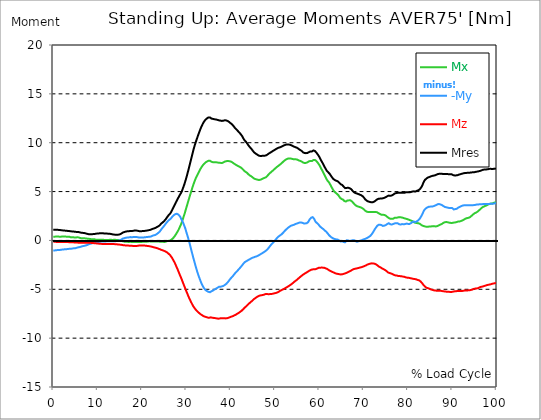
| Category |  Mx |  -My |  Mz |  Mres |
|---|---|---|---|---|
| 0.0 | 0.381 | -1.022 | -0.15 | 1.103 |
| 0.167348456675344 | 0.381 | -1.022 | -0.14 | 1.103 |
| 0.334696913350688 | 0.381 | -1.022 | -0.14 | 1.103 |
| 0.5020453700260321 | 0.401 | -1.012 | -0.15 | 1.103 |
| 0.669393826701376 | 0.411 | -1.002 | -0.15 | 1.103 |
| 0.83674228337672 | 0.421 | -0.992 | -0.15 | 1.093 |
| 1.0040907400520642 | 0.411 | -0.982 | -0.15 | 1.083 |
| 1.1621420602454444 | 0.391 | -0.992 | -0.15 | 1.083 |
| 1.3294905169207885 | 0.381 | -0.982 | -0.16 | 1.073 |
| 1.4968389735961325 | 0.371 | -0.972 | -0.16 | 1.063 |
| 1.6641874302714765 | 0.381 | -0.962 | -0.16 | 1.053 |
| 1.8315358869468206 | 0.391 | -0.952 | -0.16 | 1.043 |
| 1.9988843436221646 | 0.401 | -0.932 | -0.16 | 1.033 |
| 2.1662328002975086 | 0.401 | -0.922 | -0.16 | 1.022 |
| 2.333581256972853 | 0.391 | -0.922 | -0.16 | 1.012 |
| 2.5009297136481967 | 0.381 | -0.912 | -0.16 | 1.002 |
| 2.6682781703235405 | 0.401 | -0.892 | -0.16 | 1.002 |
| 2.8356266269988843 | 0.401 | -0.892 | -0.17 | 0.992 |
| 3.002975083674229 | 0.381 | -0.892 | -0.17 | 0.982 |
| 3.1703235403495724 | 0.371 | -0.882 | -0.17 | 0.982 |
| 3.337671997024917 | 0.381 | -0.872 | -0.17 | 0.972 |
| 3.4957233172182973 | 0.381 | -0.862 | -0.17 | 0.962 |
| 3.663071773893641 | 0.371 | -0.852 | -0.18 | 0.952 |
| 3.8304202305689854 | 0.341 | -0.852 | -0.19 | 0.942 |
| 3.997768687244329 | 0.311 | -0.852 | -0.19 | 0.932 |
| 4.165117143919673 | 0.321 | -0.832 | -0.19 | 0.922 |
| 4.332465600595017 | 0.331 | -0.822 | -0.19 | 0.912 |
| 4.499814057270361 | 0.331 | -0.812 | -0.2 | 0.902 |
| 4.667162513945706 | 0.311 | -0.802 | -0.2 | 0.902 |
| 4.834510970621049 | 0.301 | -0.802 | -0.211 | 0.892 |
| 5.001859427296393 | 0.291 | -0.792 | -0.211 | 0.882 |
| 5.169207883971737 | 0.291 | -0.772 | -0.211 | 0.872 |
| 5.336556340647081 | 0.321 | -0.742 | -0.221 | 0.862 |
| 5.503904797322425 | 0.311 | -0.722 | -0.231 | 0.852 |
| 5.671253253997769 | 0.311 | -0.702 | -0.231 | 0.862 |
| 5.82930457419115 | 0.291 | -0.692 | -0.241 | 0.852 |
| 5.996653030866494 | 0.261 | -0.672 | -0.241 | 0.822 |
| 6.164001487541838 | 0.241 | -0.642 | -0.231 | 0.802 |
| 6.331349944217181 | 0.221 | -0.622 | -0.231 | 0.782 |
| 6.498698400892526 | 0.221 | -0.591 | -0.231 | 0.772 |
| 6.66604685756787 | 0.221 | -0.581 | -0.231 | 0.772 |
| 6.833395314243213 | 0.221 | -0.571 | -0.231 | 0.772 |
| 7.000743770918558 | 0.221 | -0.551 | -0.231 | 0.752 |
| 7.168092227593902 | 0.221 | -0.531 | -0.231 | 0.732 |
| 7.335440684269246 | 0.2 | -0.511 | -0.231 | 0.712 |
| 7.50278914094459 | 0.19 | -0.481 | -0.231 | 0.692 |
| 7.6701375976199335 | 0.18 | -0.461 | -0.231 | 0.672 |
| 7.837486054295278 | 0.17 | -0.431 | -0.241 | 0.652 |
| 7.995537374488658 | 0.17 | -0.391 | -0.241 | 0.632 |
| 8.162885831164003 | 0.16 | -0.361 | -0.241 | 0.622 |
| 8.330234287839346 | 0.14 | -0.341 | -0.241 | 0.622 |
| 8.49758274451469 | 0.12 | -0.321 | -0.251 | 0.622 |
| 8.664931201190035 | 0.12 | -0.301 | -0.261 | 0.632 |
| 8.832279657865378 | 0.12 | -0.271 | -0.261 | 0.642 |
| 8.999628114540721 | 0.12 | -0.261 | -0.271 | 0.652 |
| 9.166976571216066 | 0.12 | -0.241 | -0.281 | 0.662 |
| 9.334325027891412 | 0.11 | -0.231 | -0.291 | 0.662 |
| 9.501673484566755 | 0.09 | -0.211 | -0.291 | 0.672 |
| 9.669021941242098 | 0.06 | -0.2 | -0.301 | 0.692 |
| 9.836370397917442 | 0.08 | -0.17 | -0.311 | 0.702 |
| 10.003718854592787 | 0.08 | -0.16 | -0.321 | 0.712 |
| 10.17106731126813 | 0.08 | -0.15 | -0.321 | 0.712 |
| 10.329118631461512 | 0.07 | -0.15 | -0.331 | 0.722 |
| 10.496467088136853 | 0.07 | -0.14 | -0.341 | 0.732 |
| 10.663815544812199 | 0.06 | -0.12 | -0.341 | 0.742 |
| 10.831164001487544 | 0.07 | -0.11 | -0.351 | 0.752 |
| 10.998512458162887 | 0.07 | -0.1 | -0.361 | 0.742 |
| 11.16586091483823 | 0.07 | -0.1 | -0.361 | 0.732 |
| 11.333209371513574 | 0.06 | -0.11 | -0.361 | 0.722 |
| 11.50055782818892 | 0.05 | -0.11 | -0.361 | 0.712 |
| 11.667906284864264 | 0.04 | -0.11 | -0.361 | 0.712 |
| 11.835254741539607 | 0.03 | -0.1 | -0.361 | 0.712 |
| 12.00260319821495 | 0.04 | -0.09 | -0.361 | 0.702 |
| 12.169951654890292 | 0.05 | -0.08 | -0.371 | 0.702 |
| 12.337300111565641 | 0.04 | -0.09 | -0.371 | 0.692 |
| 12.504648568240984 | 0.05 | -0.09 | -0.361 | 0.692 |
| 12.662699888434362 | 0.06 | -0.09 | -0.361 | 0.682 |
| 12.830048345109708 | 0.07 | -0.08 | -0.371 | 0.672 |
| 12.997396801785053 | 0.07 | -0.09 | -0.371 | 0.662 |
| 13.164745258460396 | 0.04 | -0.09 | -0.371 | 0.642 |
| 13.33209371513574 | 0.03 | -0.09 | -0.371 | 0.622 |
| 13.499442171811083 | 0.05 | -0.1 | -0.371 | 0.611 |
| 13.666790628486426 | 0.07 | -0.09 | -0.371 | 0.601 |
| 13.834139085161771 | 0.08 | -0.08 | -0.381 | 0.591 |
| 14.001487541837117 | 0.06 | -0.08 | -0.391 | 0.581 |
| 14.16883599851246 | 0.04 | -0.07 | -0.391 | 0.571 |
| 14.336184455187803 | 0.03 | -0.05 | -0.401 | 0.571 |
| 14.503532911863147 | 0.03 | -0.03 | -0.401 | 0.581 |
| 14.670881368538492 | 0.04 | -0.03 | -0.411 | 0.591 |
| 14.828932688731873 | 0.01 | -0.01 | -0.421 | 0.601 |
| 14.996281145407215 | -0.01 | 0.01 | -0.431 | 0.622 |
| 15.163629602082558 | -0.03 | 0.04 | -0.441 | 0.662 |
| 15.330978058757903 | -0.06 | 0.09 | -0.451 | 0.702 |
| 15.498326515433247 | -0.06 | 0.12 | -0.461 | 0.732 |
| 15.665674972108594 | -0.08 | 0.19 | -0.481 | 0.802 |
| 15.833023428783937 | -0.11 | 0.221 | -0.491 | 0.842 |
| 16.00037188545928 | -0.13 | 0.231 | -0.501 | 0.862 |
| 16.167720342134626 | -0.13 | 0.251 | -0.501 | 0.882 |
| 16.335068798809967 | -0.13 | 0.271 | -0.511 | 0.902 |
| 16.502417255485312 | -0.14 | 0.281 | -0.521 | 0.912 |
| 16.669765712160658 | -0.14 | 0.301 | -0.521 | 0.932 |
| 16.837114168836 | -0.14 | 0.311 | -0.531 | 0.932 |
| 17.004462625511344 | -0.16 | 0.311 | -0.531 | 0.942 |
| 17.16251394570472 | -0.16 | 0.331 | -0.531 | 0.952 |
| 17.32986240238007 | -0.14 | 0.341 | -0.541 | 0.962 |
| 17.497210859055414 | -0.15 | 0.341 | -0.551 | 0.962 |
| 17.664559315730756 | -0.16 | 0.331 | -0.551 | 0.962 |
| 17.8319077724061 | -0.17 | 0.331 | -0.551 | 0.972 |
| 17.999256229081443 | -0.17 | 0.341 | -0.561 | 0.982 |
| 18.166604685756788 | -0.16 | 0.351 | -0.571 | 0.992 |
| 18.333953142432133 | -0.17 | 0.361 | -0.581 | 1.012 |
| 18.501301599107478 | -0.17 | 0.371 | -0.591 | 1.022 |
| 18.668650055782823 | -0.17 | 0.361 | -0.581 | 1.012 |
| 18.835998512458165 | -0.17 | 0.341 | -0.571 | 1.002 |
| 19.00334696913351 | -0.17 | 0.331 | -0.551 | 0.992 |
| 19.170695425808855 | -0.16 | 0.311 | -0.541 | 0.972 |
| 19.338043882484197 | -0.17 | 0.291 | -0.521 | 0.952 |
| 19.496095202677576 | -0.16 | 0.291 | -0.521 | 0.952 |
| 19.66344365935292 | -0.15 | 0.291 | -0.521 | 0.942 |
| 19.830792116028263 | -0.16 | 0.291 | -0.511 | 0.942 |
| 19.998140572703612 | -0.15 | 0.291 | -0.511 | 0.952 |
| 20.165489029378953 | -0.14 | 0.291 | -0.511 | 0.952 |
| 20.3328374860543 | -0.13 | 0.301 | -0.511 | 0.952 |
| 20.500185942729644 | -0.13 | 0.321 | -0.521 | 0.962 |
| 20.667534399404985 | -0.14 | 0.331 | -0.531 | 0.982 |
| 20.83488285608033 | -0.16 | 0.331 | -0.541 | 0.982 |
| 21.002231312755672 | -0.14 | 0.341 | -0.551 | 1.002 |
| 21.16957976943102 | -0.12 | 0.351 | -0.561 | 1.022 |
| 21.336928226106362 | -0.11 | 0.361 | -0.571 | 1.033 |
| 21.504276682781704 | -0.1 | 0.361 | -0.581 | 1.053 |
| 21.67162513945705 | -0.09 | 0.371 | -0.591 | 1.063 |
| 21.82967645965043 | -0.11 | 0.381 | -0.611 | 1.083 |
| 21.997024916325774 | -0.12 | 0.401 | -0.622 | 1.103 |
| 22.16437337300112 | -0.12 | 0.441 | -0.642 | 1.143 |
| 22.33172182967646 | -0.1 | 0.471 | -0.662 | 1.173 |
| 22.499070286351806 | -0.09 | 0.501 | -0.682 | 1.203 |
| 22.666418743027148 | -0.1 | 0.521 | -0.702 | 1.223 |
| 22.833767199702496 | -0.1 | 0.541 | -0.722 | 1.253 |
| 23.00111565637784 | -0.1 | 0.561 | -0.742 | 1.273 |
| 23.168464113053183 | -0.11 | 0.601 | -0.762 | 1.323 |
| 23.335812569728528 | -0.1 | 0.652 | -0.782 | 1.363 |
| 23.50316102640387 | -0.1 | 0.702 | -0.812 | 1.403 |
| 23.670509483079215 | -0.1 | 0.772 | -0.842 | 1.444 |
| 23.83785793975456 | -0.11 | 0.812 | -0.862 | 1.474 |
| 23.995909259947936 | -0.13 | 0.902 | -0.892 | 1.544 |
| 24.163257716623285 | -0.13 | 1.002 | -0.922 | 1.624 |
| 24.330606173298627 | -0.13 | 1.123 | -0.962 | 1.734 |
| 24.49795462997397 | -0.12 | 1.213 | -0.992 | 1.794 |
| 24.665303086649313 | -0.13 | 1.313 | -1.012 | 1.845 |
| 24.83265154332466 | -0.15 | 1.413 | -1.043 | 1.925 |
| 25.0 | -0.16 | 1.494 | -1.073 | 1.985 |
| 25.167348456675345 | -0.16 | 1.604 | -1.113 | 2.085 |
| 25.334696913350694 | -0.13 | 1.694 | -1.143 | 2.165 |
| 25.502045370026035 | -0.1 | 1.794 | -1.183 | 2.276 |
| 25.669393826701377 | -0.07 | 1.895 | -1.233 | 2.386 |
| 25.836742283376722 | -0.06 | 1.975 | -1.293 | 2.476 |
| 26.004090740052067 | -0.04 | 2.055 | -1.363 | 2.586 |
| 26.17143919672741 | -0.03 | 2.115 | -1.434 | 2.667 |
| 26.329490516920792 | -0.01 | 2.155 | -1.504 | 2.737 |
| 26.49683897359613 | 0.03 | 2.235 | -1.604 | 2.857 |
| 26.66418743027148 | 0.09 | 2.336 | -1.714 | 2.997 |
| 26.831535886946828 | 0.15 | 2.426 | -1.834 | 3.138 |
| 26.998884343622166 | 0.231 | 2.506 | -1.965 | 3.298 |
| 27.166232800297514 | 0.311 | 2.586 | -2.105 | 3.448 |
| 27.333581256972852 | 0.411 | 2.626 | -2.245 | 3.599 |
| 27.5009297136482 | 0.521 | 2.687 | -2.406 | 3.759 |
| 27.668278170323543 | 0.642 | 2.717 | -2.586 | 3.92 |
| 27.835626626998888 | 0.762 | 2.727 | -2.757 | 4.06 |
| 28.002975083674233 | 0.892 | 2.717 | -2.927 | 4.2 |
| 28.170323540349575 | 1.022 | 2.656 | -3.118 | 4.351 |
| 28.33767199702492 | 1.173 | 2.596 | -3.298 | 4.491 |
| 28.50502045370026 | 1.343 | 2.496 | -3.489 | 4.631 |
| 28.663071773893645 | 1.514 | 2.376 | -3.669 | 4.762 |
| 28.830420230568986 | 1.694 | 2.215 | -3.849 | 4.882 |
| 28.99776868724433 | 1.895 | 2.045 | -4.04 | 5.042 |
| 29.165117143919673 | 2.115 | 1.915 | -4.24 | 5.263 |
| 29.33246560059502 | 2.356 | 1.744 | -4.441 | 5.463 |
| 29.499814057270367 | 2.586 | 1.544 | -4.621 | 5.674 |
| 29.66716251394571 | 2.827 | 1.353 | -4.822 | 5.904 |
| 29.834510970621054 | 3.098 | 1.123 | -5.022 | 6.165 |
| 30.00185942729639 | 3.348 | 0.852 | -5.203 | 6.416 |
| 30.169207883971744 | 3.609 | 0.611 | -5.383 | 6.696 |
| 30.33655634064708 | 3.869 | 0.361 | -5.574 | 6.987 |
| 30.50390479732243 | 4.12 | 0.09 | -5.754 | 7.268 |
| 30.671253253997772 | 4.371 | -0.18 | -5.924 | 7.568 |
| 30.829304574191156 | 4.621 | -0.481 | -6.085 | 7.879 |
| 30.996653030866494 | 4.872 | -0.782 | -6.245 | 8.19 |
| 31.164001487541842 | 5.112 | -1.073 | -6.396 | 8.491 |
| 31.331349944217187 | 5.363 | -1.363 | -6.546 | 8.791 |
| 31.498698400892525 | 5.594 | -1.654 | -6.686 | 9.092 |
| 31.666046857567874 | 5.814 | -1.935 | -6.807 | 9.383 |
| 31.833395314243212 | 6.025 | -2.205 | -6.917 | 9.644 |
| 32.00074377091856 | 6.225 | -2.486 | -7.017 | 9.894 |
| 32.1680922275939 | 6.406 | -2.757 | -7.107 | 10.125 |
| 32.33544068426925 | 6.566 | -3.007 | -7.188 | 10.345 |
| 32.50278914094459 | 6.706 | -3.258 | -7.268 | 10.566 |
| 32.670137597619934 | 6.867 | -3.489 | -7.338 | 10.776 |
| 32.83748605429528 | 7.017 | -3.709 | -7.408 | 10.987 |
| 33.004834510970625 | 7.168 | -3.91 | -7.478 | 11.187 |
| 33.162885831164004 | 7.308 | -4.11 | -7.538 | 11.388 |
| 33.33023428783935 | 7.428 | -4.311 | -7.589 | 11.568 |
| 33.497582744514695 | 7.548 | -4.481 | -7.639 | 11.739 |
| 33.664931201190036 | 7.659 | -4.631 | -7.689 | 11.899 |
| 33.83227965786538 | 7.749 | -4.772 | -7.739 | 12.039 |
| 33.99962811454073 | 7.839 | -4.892 | -7.779 | 12.17 |
| 34.16697657121607 | 7.919 | -4.982 | -7.799 | 12.27 |
| 34.33432502789141 | 7.979 | -5.082 | -7.829 | 12.36 |
| 34.50167348456676 | 8.04 | -5.153 | -7.849 | 12.44 |
| 34.6690219412421 | 8.08 | -5.183 | -7.869 | 12.49 |
| 34.83637039791744 | 8.13 | -5.213 | -7.899 | 12.551 |
| 35.00371885459279 | 8.16 | -5.263 | -7.909 | 12.591 |
| 35.17106731126814 | 8.17 | -5.283 | -7.909 | 12.611 |
| 35.338415767943474 | 8.15 | -5.303 | -7.879 | 12.591 |
| 35.49646708813686 | 8.1 | -5.263 | -7.869 | 12.531 |
| 35.6638155448122 | 8.05 | -5.203 | -7.879 | 12.47 |
| 35.831164001487544 | 8 | -5.133 | -7.909 | 12.43 |
| 35.998512458162885 | 8 | -5.133 | -7.919 | 12.44 |
| 36.165860914838234 | 7.99 | -5.092 | -7.929 | 12.42 |
| 36.333209371513576 | 8 | -5.022 | -7.939 | 12.4 |
| 36.50055782818892 | 8 | -4.972 | -7.949 | 12.38 |
| 36.667906284864266 | 8 | -4.942 | -7.969 | 12.38 |
| 36.83525474153961 | 7.99 | -4.902 | -7.979 | 12.36 |
| 37.002603198214956 | 7.979 | -4.852 | -7.99 | 12.34 |
| 37.1699516548903 | 7.969 | -4.792 | -8.01 | 12.32 |
| 37.337300111565646 | 7.949 | -4.752 | -8.01 | 12.29 |
| 37.50464856824098 | 7.929 | -4.752 | -7.99 | 12.28 |
| 37.66269988843437 | 7.939 | -4.742 | -7.969 | 12.27 |
| 37.83004834510971 | 7.929 | -4.732 | -7.959 | 12.25 |
| 37.99739680178505 | 7.919 | -4.701 | -7.949 | 12.23 |
| 38.16474525846039 | 7.939 | -4.681 | -7.959 | 12.23 |
| 38.33209371513574 | 7.979 | -4.661 | -7.969 | 12.25 |
| 38.49944217181109 | 8.02 | -4.611 | -7.969 | 12.27 |
| 38.666790628486424 | 8.07 | -4.561 | -7.979 | 12.3 |
| 38.83413908516178 | 8.1 | -4.511 | -7.979 | 12.31 |
| 39.001487541837115 | 8.11 | -4.451 | -7.969 | 12.28 |
| 39.16883599851246 | 8.13 | -4.371 | -7.959 | 12.26 |
| 39.336184455187805 | 8.13 | -4.28 | -7.939 | 12.22 |
| 39.503532911863154 | 8.11 | -4.19 | -7.919 | 12.17 |
| 39.670881368538495 | 8.11 | -4.09 | -7.889 | 12.12 |
| 39.83822982521384 | 8.11 | -3.98 | -7.859 | 12.069 |
| 39.996281145407224 | 8.08 | -3.879 | -7.829 | 11.989 |
| 40.163629602082565 | 8.04 | -3.809 | -7.799 | 11.929 |
| 40.33097805875791 | 8 | -3.739 | -7.769 | 11.869 |
| 40.498326515433256 | 7.929 | -3.649 | -7.749 | 11.769 |
| 40.6656749721086 | 7.889 | -3.549 | -7.709 | 11.689 |
| 40.83302342878393 | 7.839 | -3.448 | -7.669 | 11.598 |
| 41.00037188545929 | 7.789 | -3.348 | -7.629 | 11.498 |
| 41.16772034213463 | 7.749 | -3.268 | -7.599 | 11.428 |
| 41.33506879880997 | 7.699 | -3.198 | -7.548 | 11.348 |
| 41.50241725548531 | 7.659 | -3.118 | -7.498 | 11.268 |
| 41.66976571216066 | 7.609 | -3.017 | -7.458 | 11.177 |
| 41.837114168836 | 7.558 | -2.947 | -7.408 | 11.097 |
| 42.004462625511344 | 7.538 | -2.857 | -7.358 | 11.017 |
| 42.17181108218669 | 7.488 | -2.777 | -7.298 | 10.927 |
| 42.32986240238007 | 7.448 | -2.687 | -7.248 | 10.836 |
| 42.497210859055414 | 7.388 | -2.596 | -7.188 | 10.736 |
| 42.66455931573076 | 7.318 | -2.506 | -7.117 | 10.616 |
| 42.831907772406105 | 7.228 | -2.396 | -7.037 | 10.466 |
| 42.999256229081446 | 7.147 | -2.296 | -6.957 | 10.335 |
| 43.16660468575679 | 7.087 | -2.225 | -6.877 | 10.225 |
| 43.33395314243214 | 7.027 | -2.175 | -6.807 | 10.135 |
| 43.50130159910748 | 6.977 | -2.135 | -6.746 | 10.065 |
| 43.66865005578282 | 6.927 | -2.075 | -6.676 | 9.964 |
| 43.83599851245817 | 6.847 | -2.045 | -6.596 | 9.854 |
| 44.00334696913351 | 6.767 | -1.995 | -6.516 | 9.734 |
| 44.17069542580886 | 6.706 | -1.955 | -6.446 | 9.634 |
| 44.3380438824842 | 6.646 | -1.915 | -6.386 | 9.543 |
| 44.49609520267758 | 6.606 | -1.875 | -6.315 | 9.453 |
| 44.66344365935292 | 6.556 | -1.834 | -6.245 | 9.373 |
| 44.83079211602827 | 6.506 | -1.784 | -6.185 | 9.283 |
| 44.99814057270361 | 6.436 | -1.754 | -6.115 | 9.172 |
| 45.16548902937895 | 6.366 | -1.734 | -6.035 | 9.072 |
| 45.332837486054295 | 6.315 | -1.704 | -5.975 | 8.992 |
| 45.500185942729644 | 6.275 | -1.674 | -5.924 | 8.922 |
| 45.66753439940499 | 6.265 | -1.654 | -5.874 | 8.882 |
| 45.83488285608033 | 6.245 | -1.634 | -5.814 | 8.832 |
| 46.00223131275568 | 6.225 | -1.604 | -5.774 | 8.781 |
| 46.16957976943102 | 6.195 | -1.564 | -5.724 | 8.721 |
| 46.336928226106366 | 6.185 | -1.524 | -5.684 | 8.681 |
| 46.50427668278171 | 6.185 | -1.474 | -5.654 | 8.651 |
| 46.671625139457056 | 6.205 | -1.423 | -5.624 | 8.641 |
| 46.829676459650436 | 6.235 | -1.383 | -5.614 | 8.641 |
| 46.99702491632577 | 6.265 | -1.333 | -5.604 | 8.651 |
| 47.16437337300112 | 6.305 | -1.293 | -5.594 | 8.661 |
| 47.33172182967646 | 6.345 | -1.253 | -5.574 | 8.671 |
| 47.49907028635181 | 6.376 | -1.193 | -5.554 | 8.671 |
| 47.66641874302716 | 6.406 | -1.133 | -5.513 | 8.671 |
| 47.83376719970249 | 6.436 | -1.093 | -5.493 | 8.681 |
| 48.001115656377834 | 6.476 | -1.033 | -5.483 | 8.701 |
| 48.16846411305319 | 6.556 | -0.972 | -5.483 | 8.751 |
| 48.33581256972853 | 6.636 | -0.902 | -5.493 | 8.801 |
| 48.50316102640387 | 6.726 | -0.802 | -5.503 | 8.862 |
| 48.67050948307921 | 6.807 | -0.702 | -5.503 | 8.912 |
| 48.837857939754564 | 6.877 | -0.601 | -5.493 | 8.962 |
| 49.005206396429905 | 6.947 | -0.501 | -5.493 | 9.002 |
| 49.163257716623285 | 7.017 | -0.411 | -5.483 | 9.062 |
| 49.33060617329863 | 7.077 | -0.341 | -5.463 | 9.102 |
| 49.49795462997397 | 7.137 | -0.261 | -5.453 | 9.142 |
| 49.66530308664932 | 7.208 | -0.17 | -5.433 | 9.192 |
| 49.832651543324666 | 7.278 | -0.09 | -5.413 | 9.243 |
| 50.0 | 7.348 | 0 | -5.403 | 9.283 |
| 50.16734845667534 | 7.418 | 0.09 | -5.383 | 9.333 |
| 50.33469691335069 | 7.488 | 0.18 | -5.363 | 9.383 |
| 50.50204537002604 | 7.538 | 0.271 | -5.333 | 9.413 |
| 50.66939382670139 | 7.599 | 0.341 | -5.293 | 9.463 |
| 50.836742283376715 | 7.659 | 0.411 | -5.253 | 9.503 |
| 51.00409074005207 | 7.719 | 0.471 | -5.203 | 9.513 |
| 51.17143919672741 | 7.769 | 0.521 | -5.153 | 9.533 |
| 51.32949051692079 | 7.829 | 0.571 | -5.112 | 9.563 |
| 51.496838973596134 | 7.909 | 0.632 | -5.072 | 9.603 |
| 51.66418743027148 | 7.979 | 0.712 | -5.032 | 9.644 |
| 51.831535886946824 | 8.05 | 0.782 | -5.002 | 9.684 |
| 51.99888434362217 | 8.12 | 0.872 | -4.962 | 9.724 |
| 52.16623280029752 | 8.18 | 0.962 | -4.922 | 9.754 |
| 52.33358125697285 | 8.24 | 1.043 | -4.882 | 9.784 |
| 52.5009297136482 | 8.29 | 1.113 | -4.832 | 9.804 |
| 52.668278170323546 | 8.33 | 1.173 | -4.792 | 9.824 |
| 52.835626626998895 | 8.36 | 1.253 | -4.742 | 9.834 |
| 53.00297508367424 | 8.38 | 1.323 | -4.701 | 9.824 |
| 53.17032354034958 | 8.38 | 1.373 | -4.651 | 9.814 |
| 53.33767199702492 | 8.39 | 1.423 | -4.601 | 9.794 |
| 53.50502045370027 | 8.38 | 1.474 | -4.551 | 9.774 |
| 53.663071773893655 | 8.37 | 1.514 | -4.491 | 9.744 |
| 53.83042023056899 | 8.36 | 1.544 | -4.431 | 9.704 |
| 53.99776868724433 | 8.33 | 1.554 | -4.371 | 9.664 |
| 54.16511714391967 | 8.32 | 1.584 | -4.311 | 9.623 |
| 54.33246560059503 | 8.3 | 1.604 | -4.24 | 9.593 |
| 54.49981405727037 | 8.3 | 1.654 | -4.18 | 9.563 |
| 54.667162513945705 | 8.3 | 1.674 | -4.12 | 9.533 |
| 54.834510970621054 | 8.3 | 1.714 | -4.07 | 9.513 |
| 55.0018594272964 | 8.28 | 1.734 | -4.01 | 9.473 |
| 55.169207883971744 | 8.24 | 1.764 | -3.94 | 9.423 |
| 55.336556340647086 | 8.19 | 1.804 | -3.869 | 9.363 |
| 55.50390479732243 | 8.17 | 1.824 | -3.809 | 9.313 |
| 55.671253253997776 | 8.14 | 1.845 | -3.749 | 9.263 |
| 55.83860171067312 | 8.11 | 1.845 | -3.679 | 9.212 |
| 55.9966530308665 | 8.08 | 1.824 | -3.619 | 9.162 |
| 56.16400148754184 | 8.02 | 1.804 | -3.559 | 9.092 |
| 56.33134994421718 | 7.969 | 1.764 | -3.509 | 9.012 |
| 56.498698400892536 | 7.939 | 1.744 | -3.448 | 8.972 |
| 56.66604685756788 | 7.919 | 1.734 | -3.408 | 8.942 |
| 56.83339531424321 | 7.919 | 1.744 | -3.358 | 8.922 |
| 57.00074377091856 | 7.939 | 1.744 | -3.308 | 8.932 |
| 57.16809222759391 | 7.969 | 1.754 | -3.268 | 8.942 |
| 57.33544068426925 | 8 | 1.804 | -3.218 | 8.952 |
| 57.5027891409446 | 8.04 | 1.895 | -3.168 | 8.982 |
| 57.670137597619934 | 8.1 | 2.035 | -3.118 | 9.042 |
| 57.83748605429528 | 8.16 | 2.165 | -3.078 | 9.112 |
| 58.004834510970625 | 8.14 | 2.245 | -3.027 | 9.112 |
| 58.16288583116401 | 8.15 | 2.326 | -2.997 | 9.132 |
| 58.330234287839346 | 8.12 | 2.366 | -2.967 | 9.112 |
| 58.497582744514695 | 8.2 | 2.386 | -2.967 | 9.192 |
| 58.66493120119004 | 8.23 | 2.326 | -2.947 | 9.212 |
| 58.832279657865385 | 8.26 | 2.205 | -2.937 | 9.192 |
| 58.999628114540734 | 8.24 | 2.045 | -2.947 | 9.152 |
| 59.16697657121607 | 8.19 | 1.905 | -2.937 | 9.082 |
| 59.33432502789142 | 8.12 | 1.845 | -2.907 | 8.992 |
| 59.50167348456676 | 8.04 | 1.764 | -2.877 | 8.892 |
| 59.66902194124211 | 7.939 | 1.684 | -2.847 | 8.781 |
| 59.83637039791745 | 7.839 | 1.614 | -2.807 | 8.671 |
| 60.00371885459278 | 7.719 | 1.524 | -2.797 | 8.541 |
| 60.17106731126813 | 7.579 | 1.423 | -2.797 | 8.401 |
| 60.33841576794349 | 7.428 | 1.353 | -2.787 | 8.25 |
| 60.49646708813685 | 7.288 | 1.293 | -2.777 | 8.11 |
| 60.6638155448122 | 7.147 | 1.233 | -2.787 | 7.979 |
| 60.831164001487544 | 7.007 | 1.183 | -2.787 | 7.839 |
| 60.99851245816289 | 6.857 | 1.113 | -2.797 | 7.689 |
| 61.16586091483824 | 6.706 | 1.043 | -2.807 | 7.548 |
| 61.333209371513576 | 6.556 | 0.982 | -2.837 | 7.408 |
| 61.50055782818892 | 6.406 | 0.912 | -2.867 | 7.278 |
| 61.667906284864266 | 6.245 | 0.832 | -2.897 | 7.127 |
| 61.835254741539615 | 6.125 | 0.752 | -2.937 | 7.027 |
| 62.002603198214956 | 6.035 | 0.652 | -2.987 | 6.977 |
| 62.16995165489029 | 5.945 | 0.551 | -3.047 | 6.917 |
| 62.33730011156564 | 5.824 | 0.491 | -3.078 | 6.817 |
| 62.504648568240995 | 5.684 | 0.401 | -3.128 | 6.716 |
| 62.67199702491633 | 5.534 | 0.341 | -3.158 | 6.596 |
| 62.83004834510971 | 5.393 | 0.281 | -3.198 | 6.476 |
| 62.99739680178505 | 5.263 | 0.241 | -3.238 | 6.386 |
| 63.1647452584604 | 5.133 | 0.2 | -3.268 | 6.285 |
| 63.33209371513575 | 5.022 | 0.17 | -3.308 | 6.225 |
| 63.4994421718111 | 4.952 | 0.14 | -3.338 | 6.185 |
| 63.666790628486424 | 4.882 | 0.11 | -3.378 | 6.135 |
| 63.83413908516177 | 4.822 | 0.1 | -3.398 | 6.105 |
| 64.00148754183712 | 4.762 | 0.09 | -3.418 | 6.075 |
| 64.16883599851248 | 4.701 | 0.08 | -3.428 | 6.045 |
| 64.3361844551878 | 4.611 | 0.04 | -3.448 | 5.985 |
| 64.50353291186315 | 4.481 | -0.02 | -3.458 | 5.894 |
| 64.6708813685385 | 4.371 | -0.07 | -3.468 | 5.804 |
| 64.83822982521384 | 4.29 | -0.11 | -3.478 | 5.744 |
| 65.00557828188919 | 4.24 | -0.11 | -3.468 | 5.694 |
| 65.16362960208257 | 4.24 | -0.08 | -3.468 | 5.674 |
| 65.3309780587579 | 4.18 | -0.1 | -3.448 | 5.604 |
| 65.49832651543326 | 4.1 | -0.17 | -3.418 | 5.503 |
| 65.6656749721086 | 4.03 | -0.211 | -3.398 | 5.413 |
| 65.83302342878395 | 3.98 | -0.19 | -3.368 | 5.353 |
| 66.00037188545929 | 3.98 | -0.1 | -3.358 | 5.343 |
| 66.16772034213463 | 4.04 | 0.01 | -3.318 | 5.373 |
| 66.33506879880998 | 4.09 | 0.04 | -3.278 | 5.393 |
| 66.50241725548531 | 4.13 | 0 | -3.238 | 5.393 |
| 66.66976571216065 | 4.1 | -0.02 | -3.208 | 5.353 |
| 66.83711416883601 | 4.12 | -0.06 | -3.168 | 5.343 |
| 67.00446262551135 | 4.11 | -0.05 | -3.128 | 5.313 |
| 67.1718110821867 | 4.07 | -0.02 | -3.088 | 5.253 |
| 67.32986240238007 | 4 | 0.01 | -3.037 | 5.173 |
| 67.49721085905541 | 3.92 | 0.02 | -2.987 | 5.082 |
| 67.66455931573076 | 3.839 | 0.03 | -2.957 | 5.002 |
| 67.83190777240611 | 3.749 | 0.02 | -2.927 | 4.932 |
| 67.99925622908145 | 3.669 | -0.02 | -2.907 | 4.882 |
| 68.16660468575678 | 3.609 | -0.07 | -2.887 | 4.842 |
| 68.33395314243214 | 3.549 | -0.11 | -2.877 | 4.822 |
| 68.50130159910749 | 3.509 | -0.13 | -2.857 | 4.802 |
| 68.66865005578282 | 3.478 | -0.12 | -2.837 | 4.772 |
| 68.83599851245816 | 3.448 | -0.09 | -2.817 | 4.742 |
| 69.00334696913352 | 3.428 | -0.06 | -2.797 | 4.712 |
| 69.17069542580886 | 3.408 | -0.04 | -2.777 | 4.681 |
| 69.3380438824842 | 3.388 | -0.02 | -2.757 | 4.661 |
| 69.50539233915956 | 3.348 | 0 | -2.737 | 4.611 |
| 69.66344365935292 | 3.308 | 0.04 | -2.717 | 4.551 |
| 69.83079211602826 | 3.268 | 0.08 | -2.687 | 4.501 |
| 69.99814057270362 | 3.198 | 0.1 | -2.656 | 4.411 |
| 70.16548902937896 | 3.128 | 0.13 | -2.626 | 4.321 |
| 70.33283748605429 | 3.047 | 0.15 | -2.586 | 4.21 |
| 70.50018594272964 | 2.997 | 0.19 | -2.556 | 4.14 |
| 70.667534399405 | 2.947 | 0.211 | -2.526 | 4.08 |
| 70.83488285608033 | 2.927 | 0.261 | -2.476 | 4.02 |
| 71.00223131275568 | 2.907 | 0.311 | -2.446 | 3.99 |
| 71.16957976943102 | 2.907 | 0.361 | -2.416 | 3.97 |
| 71.33692822610637 | 2.907 | 0.411 | -2.386 | 3.95 |
| 71.50427668278171 | 2.907 | 0.461 | -2.376 | 3.93 |
| 71.67162513945706 | 2.907 | 0.541 | -2.356 | 3.91 |
| 71.8389735961324 | 2.907 | 0.642 | -2.346 | 3.889 |
| 71.99702491632577 | 2.897 | 0.762 | -2.346 | 3.9 |
| 72.16437337300113 | 2.897 | 0.872 | -2.356 | 3.91 |
| 72.33172182967647 | 2.897 | 1.002 | -2.366 | 3.96 |
| 72.49907028635181 | 2.907 | 1.133 | -2.386 | 4.01 |
| 72.66641874302715 | 2.917 | 1.243 | -2.416 | 4.06 |
| 72.8337671997025 | 2.907 | 1.353 | -2.456 | 4.12 |
| 73.00111565637783 | 2.887 | 1.464 | -2.516 | 4.19 |
| 73.16846411305319 | 2.847 | 1.544 | -2.576 | 4.24 |
| 73.33581256972853 | 2.797 | 1.594 | -2.636 | 4.26 |
| 73.50316102640387 | 2.747 | 1.584 | -2.697 | 4.27 |
| 73.67050948307921 | 2.707 | 1.614 | -2.727 | 4.28 |
| 73.83785793975457 | 2.667 | 1.604 | -2.767 | 4.28 |
| 74.00520639642991 | 2.636 | 1.574 | -2.817 | 4.29 |
| 74.16325771662328 | 2.626 | 1.534 | -2.867 | 4.301 |
| 74.33060617329863 | 2.626 | 1.484 | -2.907 | 4.311 |
| 74.49795462997398 | 2.626 | 1.464 | -2.947 | 4.321 |
| 74.66530308664932 | 2.606 | 1.514 | -2.977 | 4.361 |
| 74.83265154332466 | 2.576 | 1.534 | -3.027 | 4.391 |
| 75.00000000000001 | 2.536 | 1.574 | -3.088 | 4.431 |
| 75.16734845667534 | 2.486 | 1.614 | -3.138 | 4.461 |
| 75.3346969133507 | 2.406 | 1.684 | -3.208 | 4.521 |
| 75.50204537002605 | 2.346 | 1.724 | -3.278 | 4.571 |
| 75.66939382670138 | 2.296 | 1.764 | -3.308 | 4.591 |
| 75.83674228337672 | 2.245 | 1.724 | -3.338 | 4.581 |
| 76.00409074005208 | 2.215 | 1.654 | -3.358 | 4.561 |
| 76.17143919672742 | 2.205 | 1.604 | -3.378 | 4.551 |
| 76.33878765340276 | 2.205 | 1.624 | -3.408 | 4.601 |
| 76.49683897359614 | 2.205 | 1.664 | -3.448 | 4.641 |
| 76.66418743027148 | 2.225 | 1.684 | -3.489 | 4.681 |
| 76.83153588694682 | 2.266 | 1.714 | -3.529 | 4.752 |
| 76.99888434362218 | 2.316 | 1.744 | -3.569 | 4.802 |
| 77.16623280029752 | 2.326 | 1.734 | -3.579 | 4.812 |
| 77.33358125697285 | 2.316 | 1.754 | -3.579 | 4.842 |
| 77.5009297136482 | 2.326 | 1.764 | -3.599 | 4.852 |
| 77.66827817032356 | 2.346 | 1.754 | -3.619 | 4.872 |
| 77.83562662699889 | 2.376 | 1.714 | -3.639 | 4.882 |
| 78.00297508367423 | 2.386 | 1.664 | -3.649 | 4.882 |
| 78.17032354034959 | 2.376 | 1.634 | -3.649 | 4.872 |
| 78.33767199702493 | 2.366 | 1.624 | -3.659 | 4.872 |
| 78.50502045370027 | 2.346 | 1.654 | -3.669 | 4.872 |
| 78.67236891037561 | 2.346 | 1.674 | -3.689 | 4.882 |
| 78.83042023056899 | 2.326 | 1.674 | -3.699 | 4.892 |
| 78.99776868724433 | 2.296 | 1.654 | -3.709 | 4.882 |
| 79.16511714391969 | 2.256 | 1.654 | -3.719 | 4.872 |
| 79.33246560059503 | 2.245 | 1.674 | -3.749 | 4.892 |
| 79.49981405727036 | 2.225 | 1.704 | -3.779 | 4.922 |
| 79.66716251394571 | 2.205 | 1.724 | -3.799 | 4.942 |
| 79.83451097062107 | 2.185 | 1.714 | -3.809 | 4.942 |
| 80.00185942729641 | 2.155 | 1.694 | -3.819 | 4.942 |
| 80.16920788397174 | 2.125 | 1.674 | -3.819 | 4.922 |
| 80.33655634064709 | 2.095 | 1.684 | -3.829 | 4.922 |
| 80.50390479732243 | 2.055 | 1.724 | -3.859 | 4.942 |
| 80.67125325399778 | 2.035 | 1.764 | -3.869 | 4.952 |
| 80.83860171067312 | 2.015 | 1.824 | -3.889 | 4.992 |
| 80.99665303086651 | 1.975 | 1.875 | -3.91 | 5.012 |
| 81.16400148754184 | 1.925 | 1.895 | -3.93 | 5.012 |
| 81.3313499442172 | 1.865 | 1.935 | -3.95 | 5.022 |
| 81.49869840089255 | 1.834 | 1.905 | -3.95 | 5.012 |
| 81.66604685756786 | 1.804 | 1.885 | -3.96 | 5.002 |
| 81.83339531424322 | 1.784 | 1.905 | -3.98 | 5.032 |
| 82.00074377091858 | 1.774 | 1.955 | -4.01 | 5.072 |
| 82.16809222759392 | 1.764 | 2.015 | -4.04 | 5.102 |
| 82.33544068426926 | 1.764 | 2.065 | -4.05 | 5.133 |
| 82.50278914094459 | 1.744 | 2.135 | -4.08 | 5.173 |
| 82.67013759761994 | 1.704 | 2.235 | -4.13 | 5.233 |
| 82.83748605429528 | 1.654 | 2.346 | -4.19 | 5.323 |
| 83.00483451097062 | 1.584 | 2.486 | -4.28 | 5.433 |
| 83.17218296764597 | 1.544 | 2.616 | -4.361 | 5.564 |
| 83.33023428783935 | 1.504 | 2.787 | -4.461 | 5.744 |
| 83.4975827445147 | 1.474 | 2.947 | -4.561 | 5.924 |
| 83.66493120119004 | 1.454 | 3.098 | -4.651 | 6.085 |
| 83.83227965786537 | 1.444 | 3.198 | -4.722 | 6.195 |
| 83.99962811454073 | 1.413 | 3.268 | -4.782 | 6.275 |
| 84.16697657121607 | 1.393 | 3.318 | -4.842 | 6.335 |
| 84.33432502789142 | 1.393 | 3.368 | -4.862 | 6.376 |
| 84.50167348456677 | 1.403 | 3.418 | -4.882 | 6.436 |
| 84.6690219412421 | 1.413 | 3.448 | -4.912 | 6.476 |
| 84.83637039791745 | 1.413 | 3.458 | -4.942 | 6.496 |
| 85.0037188545928 | 1.413 | 3.458 | -4.972 | 6.516 |
| 85.17106731126813 | 1.423 | 3.458 | -5.012 | 6.556 |
| 85.33841576794349 | 1.444 | 3.468 | -5.042 | 6.576 |
| 85.50576422461883 | 1.464 | 3.478 | -5.062 | 6.606 |
| 85.66381554481221 | 1.464 | 3.489 | -5.082 | 6.616 |
| 85.83116400148755 | 1.464 | 3.509 | -5.102 | 6.636 |
| 85.99851245816289 | 1.444 | 3.549 | -5.123 | 6.666 |
| 86.16586091483823 | 1.423 | 3.559 | -5.133 | 6.676 |
| 86.33320937151358 | 1.434 | 3.609 | -5.133 | 6.706 |
| 86.50055782818893 | 1.454 | 3.659 | -5.143 | 6.746 |
| 86.66790628486427 | 1.474 | 3.699 | -5.153 | 6.777 |
| 86.83525474153961 | 1.504 | 3.729 | -5.143 | 6.807 |
| 87.00260319821496 | 1.554 | 3.729 | -5.143 | 6.817 |
| 87.16995165489031 | 1.594 | 3.699 | -5.143 | 6.817 |
| 87.33730011156564 | 1.624 | 3.679 | -5.153 | 6.807 |
| 87.504648568241 | 1.634 | 3.669 | -5.163 | 6.827 |
| 87.67199702491634 | 1.694 | 3.619 | -5.183 | 6.817 |
| 87.83004834510972 | 1.764 | 3.559 | -5.193 | 6.807 |
| 87.99739680178506 | 1.804 | 3.509 | -5.203 | 6.807 |
| 88.1647452584604 | 1.845 | 3.458 | -5.213 | 6.797 |
| 88.33209371513574 | 1.865 | 3.428 | -5.233 | 6.797 |
| 88.49944217181108 | 1.875 | 3.398 | -5.233 | 6.797 |
| 88.66679062848644 | 1.885 | 3.388 | -5.243 | 6.797 |
| 88.83413908516178 | 1.885 | 3.368 | -5.253 | 6.797 |
| 89.00148754183712 | 1.855 | 3.348 | -5.253 | 6.787 |
| 89.16883599851246 | 1.834 | 3.328 | -5.253 | 6.777 |
| 89.33618445518782 | 1.814 | 3.318 | -5.263 | 6.767 |
| 89.50353291186315 | 1.804 | 3.328 | -5.273 | 6.767 |
| 89.6708813685385 | 1.794 | 3.328 | -5.273 | 6.767 |
| 89.83822982521386 | 1.794 | 3.328 | -5.273 | 6.767 |
| 90.00557828188919 | 1.794 | 3.308 | -5.273 | 6.756 |
| 90.16362960208257 | 1.804 | 3.218 | -5.243 | 6.686 |
| 90.3309780587579 | 1.824 | 3.168 | -5.223 | 6.656 |
| 90.49832651543326 | 1.834 | 3.188 | -5.213 | 6.656 |
| 90.66567497210859 | 1.845 | 3.208 | -5.203 | 6.666 |
| 90.83302342878395 | 1.865 | 3.218 | -5.193 | 6.656 |
| 91.00037188545929 | 1.885 | 3.238 | -5.183 | 6.666 |
| 91.16772034213463 | 1.905 | 3.288 | -5.183 | 6.676 |
| 91.33506879880998 | 1.935 | 3.358 | -5.183 | 6.716 |
| 91.50241725548533 | 1.945 | 3.398 | -5.173 | 6.736 |
| 91.66976571216065 | 1.945 | 3.428 | -5.173 | 6.746 |
| 91.83711416883601 | 1.965 | 3.468 | -5.173 | 6.777 |
| 92.00446262551137 | 1.995 | 3.509 | -5.173 | 6.797 |
| 92.1718110821867 | 2.025 | 3.549 | -5.173 | 6.827 |
| 92.33915953886203 | 2.055 | 3.569 | -5.163 | 6.847 |
| 92.49721085905541 | 2.095 | 3.589 | -5.153 | 6.867 |
| 92.66455931573077 | 2.145 | 3.599 | -5.143 | 6.887 |
| 92.83190777240611 | 2.195 | 3.599 | -5.123 | 6.897 |
| 92.99925622908145 | 2.235 | 3.599 | -5.112 | 6.907 |
| 93.1666046857568 | 2.256 | 3.599 | -5.112 | 6.907 |
| 93.33395314243214 | 2.286 | 3.609 | -5.112 | 6.917 |
| 93.50130159910749 | 2.306 | 3.609 | -5.112 | 6.927 |
| 93.66865005578283 | 2.316 | 3.609 | -5.112 | 6.927 |
| 93.83599851245818 | 2.326 | 3.609 | -5.102 | 6.927 |
| 94.00334696913353 | 2.386 | 3.599 | -5.092 | 6.927 |
| 94.17069542580886 | 2.476 | 3.599 | -5.072 | 6.947 |
| 94.3380438824842 | 2.516 | 3.609 | -5.062 | 6.957 |
| 94.50539233915954 | 2.576 | 3.609 | -5.032 | 6.967 |
| 94.66344365935292 | 2.646 | 3.609 | -4.992 | 6.967 |
| 94.83079211602828 | 2.707 | 3.609 | -4.962 | 6.967 |
| 94.99814057270362 | 2.777 | 3.619 | -4.932 | 6.987 |
| 95.16548902937897 | 2.817 | 3.639 | -4.932 | 7.007 |
| 95.33283748605432 | 2.837 | 3.649 | -4.932 | 7.007 |
| 95.50018594272963 | 2.897 | 3.669 | -4.912 | 7.037 |
| 95.66753439940499 | 2.937 | 3.689 | -4.912 | 7.047 |
| 95.83488285608034 | 2.987 | 3.689 | -4.882 | 7.057 |
| 96.00223131275567 | 3.067 | 3.689 | -4.832 | 7.077 |
| 96.16957976943102 | 3.138 | 3.699 | -4.802 | 7.107 |
| 96.33692822610638 | 3.198 | 3.709 | -4.772 | 7.127 |
| 96.50427668278171 | 3.278 | 3.699 | -4.742 | 7.147 |
| 96.67162513945706 | 3.348 | 3.699 | -4.732 | 7.188 |
| 96.8389735961324 | 3.408 | 3.719 | -4.722 | 7.218 |
| 96.99702491632577 | 3.448 | 3.729 | -4.701 | 7.238 |
| 97.16437337300111 | 3.478 | 3.729 | -4.671 | 7.248 |
| 97.33172182967647 | 3.509 | 3.729 | -4.651 | 7.248 |
| 97.49907028635181 | 3.539 | 3.719 | -4.621 | 7.248 |
| 97.66641874302715 | 3.579 | 3.719 | -4.591 | 7.258 |
| 97.8337671997025 | 3.619 | 3.729 | -4.571 | 7.278 |
| 98.00111565637785 | 3.659 | 3.719 | -4.551 | 7.288 |
| 98.16846411305319 | 3.689 | 3.709 | -4.531 | 7.298 |
| 98.33581256972855 | 3.729 | 3.729 | -4.521 | 7.318 |
| 98.50316102640389 | 3.759 | 3.759 | -4.511 | 7.338 |
| 98.67050948307921 | 3.769 | 3.759 | -4.491 | 7.338 |
| 98.83785793975456 | 3.769 | 3.749 | -4.461 | 7.318 |
| 99.0052063964299 | 3.779 | 3.739 | -4.441 | 7.298 |
| 99.17255485310525 | 3.809 | 3.739 | -4.421 | 7.308 |
| 99.33060617329863 | 3.839 | 3.769 | -4.411 | 7.338 |
| 99.49795462997399 | 3.869 | 3.799 | -4.391 | 7.348 |
| 99.66530308664933 | 3.889 | 3.809 | -4.371 | 7.358 |
| 99.83265154332467 | 3.889 | 3.809 | -4.351 | 7.338 |
| 100.0 | 3.879 | 3.799 | -4.321 | 7.308 |